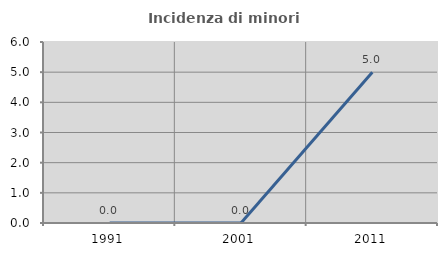
| Category | Incidenza di minori stranieri |
|---|---|
| 1991.0 | 0 |
| 2001.0 | 0 |
| 2011.0 | 5 |